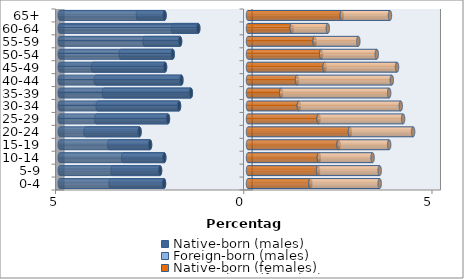
| Category | Native-born (males) | Foreign-born (males) | Native-born (females) | Foreign-born (females) |
|---|---|---|---|---|
| 0-4 | -2.231 | -1.42 | 1.658 | 1.84 |
| 5-9 | -2.336 | -1.259 | 1.861 | 1.637 |
| 10-14 | -2.224 | -1.091 | 1.882 | 1.427 |
| 15-19 | -2.602 | -1.084 | 2.406 | 1.343 |
| 20-24 | -2.882 | -1.434 | 2.707 | 1.679 |
| 25-29 | -2.126 | -1.903 | 1.875 | 2.245 |
| 30-34 | -1.833 | -2.161 | 1.35 | 2.707 |
| 35-39 | -1.518 | -2.308 | 0.881 | 2.868 |
| 40-44 | -1.77 | -2.273 | 1.301 | 2.518 |
| 45-49 | -2.203 | -1.917 | 2.036 | 1.924 |
| 50-54 | -2.001 | -1.378 | 1.945 | 1.476 |
| 55-59 | -1.805 | -0.937 | 1.77 | 1.161 |
| 60-64 | -1.322 | -0.672 | 1.161 | 0.958 |
| 65+ | -2.217 | -0.706 | 2.49 | 1.28 |